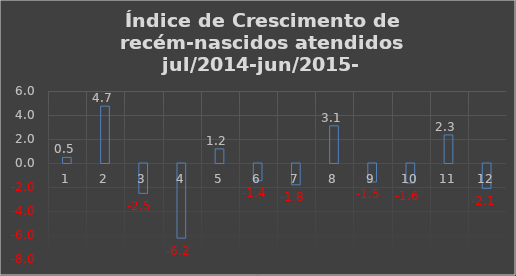
| Category | Ind. Cres |
|---|---|
| 0 | 0.468 |
| 1 | 4.738 |
| 2 | -2.492 |
| 3 | -6.218 |
| 4 | 1.175 |
| 5 | -1.431 |
| 6 | -1.773 |
| 7 | 3.096 |
| 8 | -1.54 |
| 9 | -1.627 |
| 10 | 2.339 |
| 11 | -2.072 |